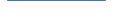
| Category | Series 0 |
|---|---|
| 0 | 32 |
| 1 | 42 |
| 2 | 52 |
| 3 | 52 |
| 4 | 45 |
| 5 | 39 |
| 6 | 48 |
| 7 | 32 |
| 8 | 41 |